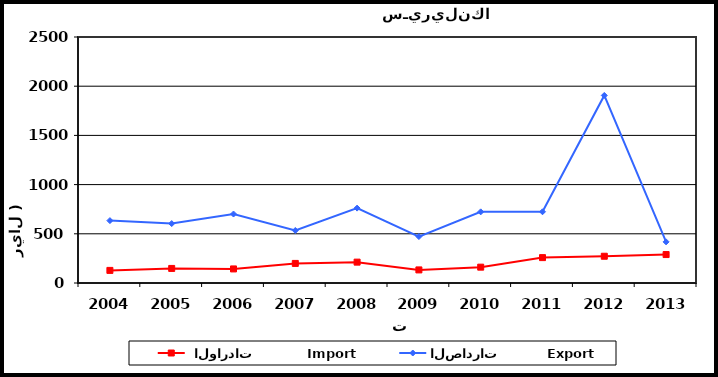
| Category |  الواردات           Import | الصادرات          Export |
|---|---|---|
| 2004.0 | 128 | 634 |
| 2005.0 | 148 | 604 |
| 2006.0 | 143 | 701 |
| 2007.0 | 199 | 534 |
| 2008.0 | 212 | 761 |
| 2009.0 | 133 | 472 |
| 2010.0 | 161 | 723 |
| 2011.0 | 258 | 724 |
| 2012.0 | 272 | 1906 |
| 2013.0 | 289 | 418 |